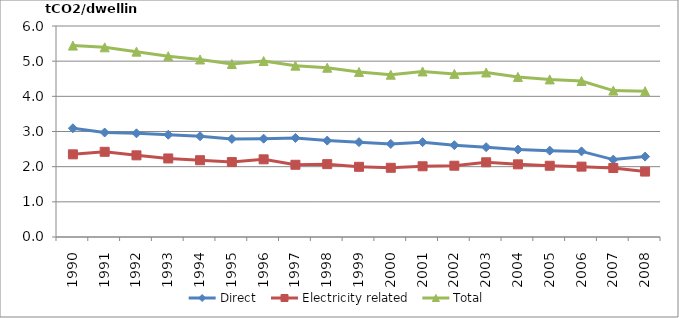
| Category | Direct | Electricity related | Total |
|---|---|---|---|
| 1990.0 | 3.092 | 2.35 | 5.442 |
| 1991.0 | 2.971 | 2.422 | 5.394 |
| 1992.0 | 2.949 | 2.322 | 5.271 |
| 1993.0 | 2.908 | 2.233 | 5.141 |
| 1994.0 | 2.864 | 2.183 | 5.047 |
| 1995.0 | 2.789 | 2.131 | 4.92 |
| 1996.0 | 2.796 | 2.209 | 5.004 |
| 1997.0 | 2.817 | 2.054 | 4.871 |
| 1998.0 | 2.741 | 2.072 | 4.813 |
| 1999.0 | 2.698 | 1.996 | 4.693 |
| 2000.0 | 2.646 | 1.968 | 4.614 |
| 2001.0 | 2.697 | 2.011 | 4.707 |
| 2002.0 | 2.611 | 2.027 | 4.638 |
| 2003.0 | 2.555 | 2.124 | 4.679 |
| 2004.0 | 2.486 | 2.066 | 4.552 |
| 2005.0 | 2.455 | 2.026 | 4.481 |
| 2006.0 | 2.435 | 2.001 | 4.436 |
| 2007.0 | 2.201 | 1.962 | 4.163 |
| 2008.0 | 2.286 | 1.86 | 4.146 |